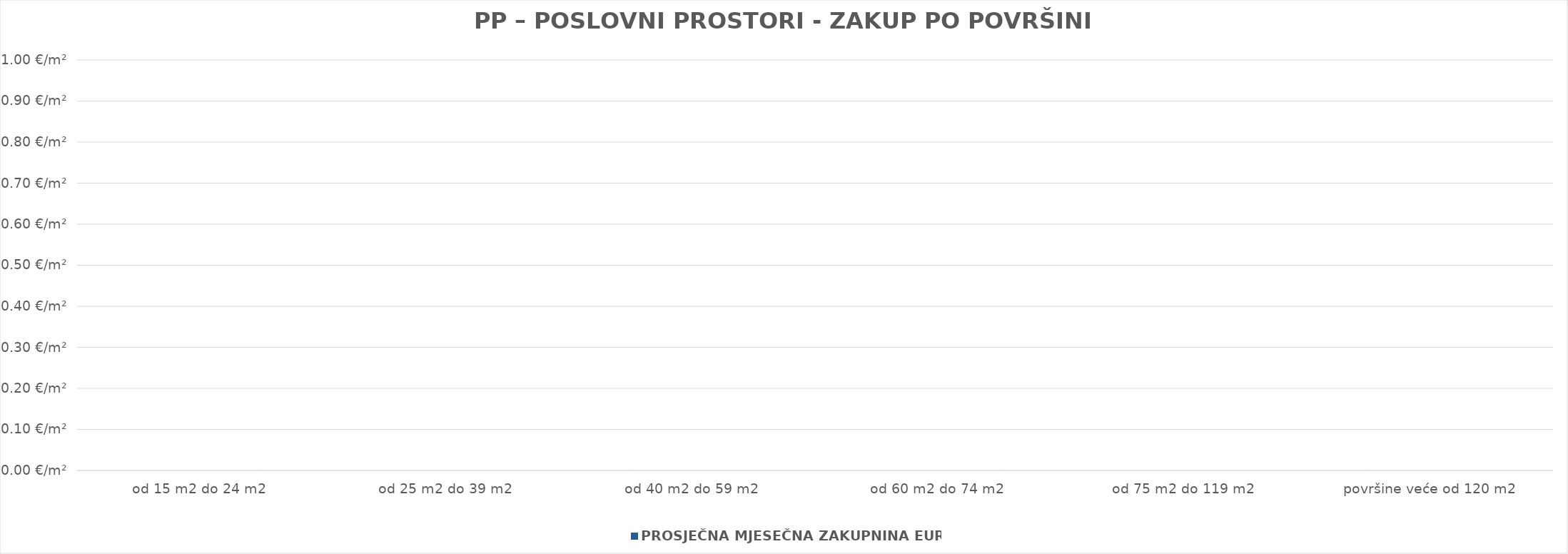
| Category | PROSJEČNA MJESEČNA ZAKUPNINA EUR/m2 |
|---|---|
| od 15 m2 do 24 m2 | 0 |
| od 25 m2 do 39 m2 | 0 |
| od 40 m2 do 59 m2 | 0 |
| od 60 m2 do 74 m2 | 0 |
| od 75 m2 do 119 m2 | 0 |
| površine veće od 120 m2 | 0 |